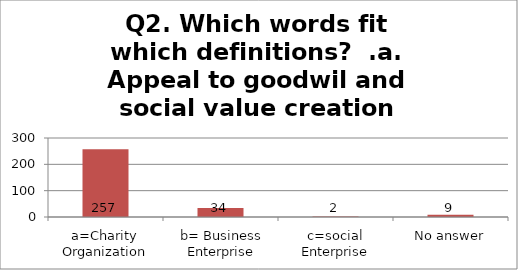
| Category | Q2. Which words fit which definitions?  .a. Appeal to goodwil and social value creation |
|---|---|
| a=Charity Organization | 257 |
| b= Business Enterprise | 34 |
| c=social Enterprise | 2 |
| No answer | 9 |